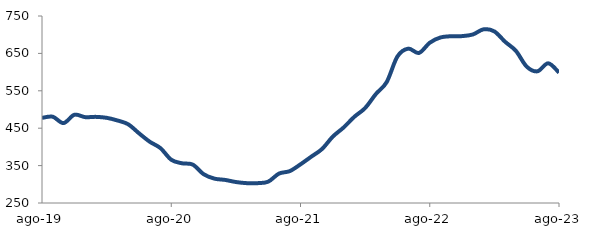
| Category | Series 0 |
|---|---|
| 2019-08-01 | 477.544 |
| 2019-09-01 | 480.652 |
| 2019-10-01 | 463.67 |
| 2019-11-01 | 485.887 |
| 2019-12-01 | 479.593 |
| 2020-01-01 | 480.293 |
| 2020-02-01 | 477.774 |
| 2020-03-01 | 470.708 |
| 2020-04-01 | 460.537 |
| 2020-05-01 | 436.562 |
| 2020-06-01 | 413.857 |
| 2020-07-01 | 396.652 |
| 2020-08-01 | 365.687 |
| 2020-09-01 | 356.18 |
| 2020-10-01 | 352.658 |
| 2020-11-01 | 327.164 |
| 2020-12-01 | 315.173 |
| 2021-01-01 | 311.708 |
| 2021-02-01 | 306.103 |
| 2021-03-01 | 303.075 |
| 2021-04-01 | 303.034 |
| 2021-05-01 | 306.996 |
| 2021-06-01 | 328.614 |
| 2021-07-01 | 335.232 |
| 2021-08-01 | 353.414 |
| 2021-09-01 | 373.869 |
| 2021-10-01 | 394.393 |
| 2021-11-01 | 427.592 |
| 2021-12-01 | 451.83 |
| 2022-01-01 | 480.528 |
| 2022-02-01 | 503.882 |
| 2022-03-01 | 541.428 |
| 2022-04-01 | 573.261 |
| 2022-05-01 | 641.774 |
| 2022-06-01 | 662.728 |
| 2022-07-01 | 651.267 |
| 2022-08-01 | 678.506 |
| 2022-09-01 | 692.688 |
| 2022-10-01 | 695.873 |
| 2022-11-01 | 696.235 |
| 2022-12-01 | 700.598 |
| 2023-01-01 | 714.422 |
| 2023-02-01 | 708.75 |
| 2023-03-01 | 680.994 |
| 2023-04-01 | 656.708 |
| 2023-05-01 | 614.698 |
| 2023-06-01 | 602.139 |
| 2023-07-01 | 623.52 |
| 2023-08-01 | 598.686 |